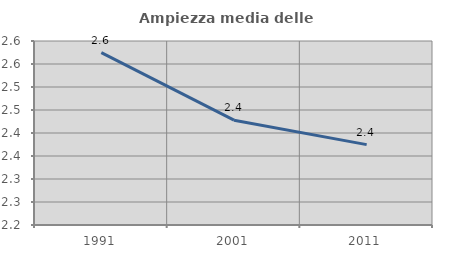
| Category | Ampiezza media delle famiglie |
|---|---|
| 1991.0 | 2.575 |
| 2001.0 | 2.428 |
| 2011.0 | 2.375 |